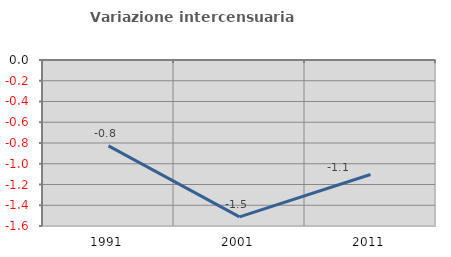
| Category | Variazione intercensuaria annua |
|---|---|
| 1991.0 | -0.828 |
| 2001.0 | -1.513 |
| 2011.0 | -1.104 |